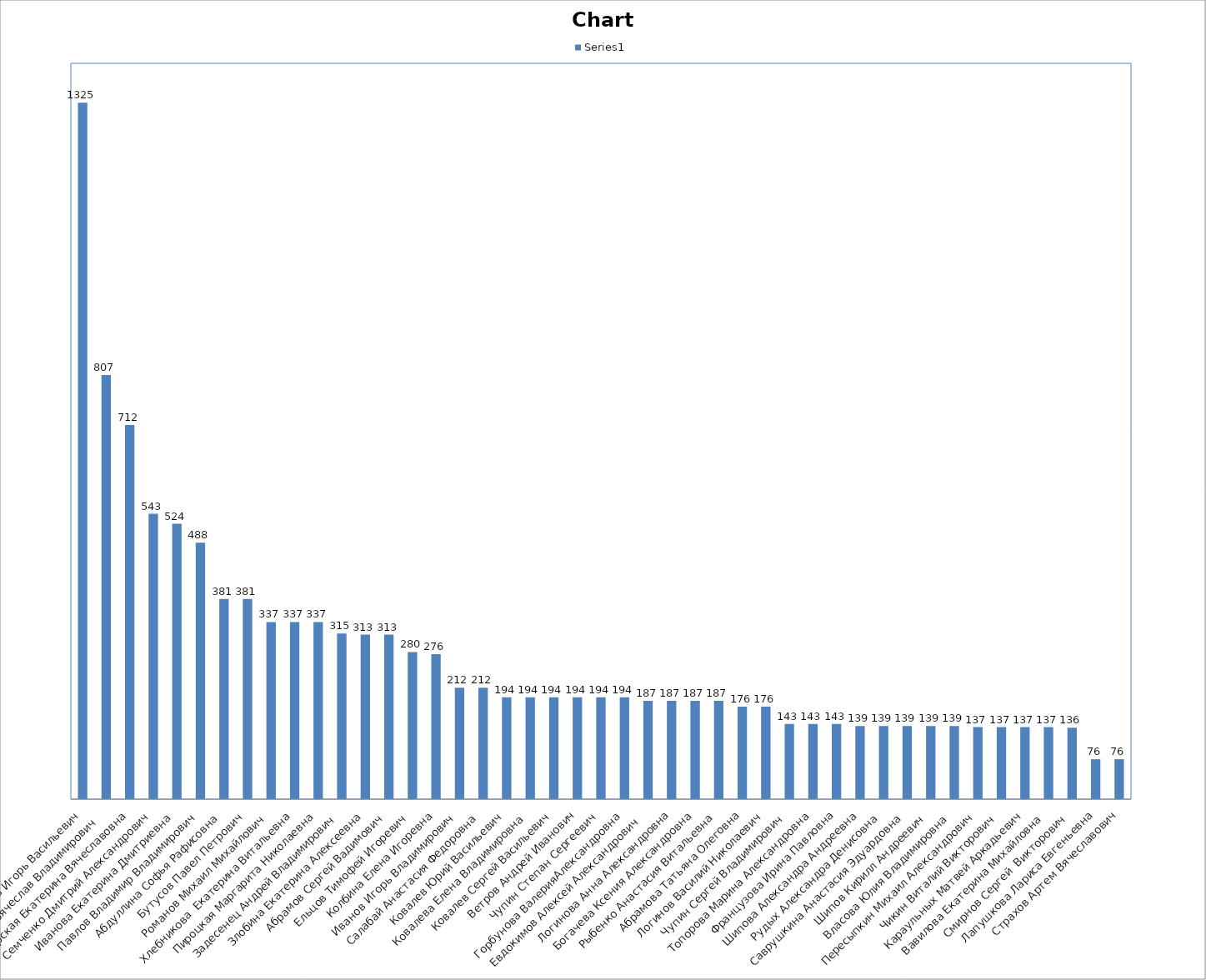
| Category | Series 0 |
|---|---|
| Макаров Игорь Васильевич | 1325 |
| Татарский Вячеслав Владимирович  | 807 |
| Татарская Екатерина Вячеславовна | 712 |
| Семченко Дмитрий Александрович | 543 |
| Иванова Екатерина Дмитриевна  | 524 |
| Павлов Владимир Владимирович | 488 |
| Абдуллина Софья Рафисовна | 381 |
| Бутусов Павел Петрович | 381 |
| Романов Михаил Михайлович | 337 |
| Хлебникова  Екатерина Витальевна | 337 |
| Пироцкая Маргарита Николаевна | 337 |
| Задесенец Андрей Владимирович | 315 |
| Злобина Екатерина Алексеевна | 313 |
| Абрамов Сергей Вадимович | 313 |
| Ельцов Тимофей Игоревич | 280 |
| Колбина Елена Игоревна | 276 |
| Иванов Игорь Владимирович | 212 |
| Салабай Анастасия Федоровна | 212 |
| Ковалев Юрий Васильевич | 194 |
| Ковалева Елена Владимировна | 194 |
| Ковалев Сергей Васильевич | 194 |
| Ветров Андрей Иванович | 194 |
| Чупин Степан Сергеевич | 194 |
| Горбунова ВалерияАлександровна | 194 |
| Евдокимов Алексей Александрович  | 187 |
| Логинова Анна Александровна | 187 |
| Богачева Ксения Александровна | 187 |
| Рыбенко Анастасия Витальевна | 187 |
| Абрамова Татьяна Олеговна | 176 |
| Логинов Василий Николаевич | 176 |
| Чупин Сергей Владимирович | 143 |
| Топорова Марина Александровна | 143 |
| Французова Ирина Павловна | 143 |
| Шипова Александра Андреевна | 139 |
| Рудых Александра Денисовна | 139 |
| Саврушкина Анастасия Эдуардовна | 139 |
| Шипов Кирилл Андреевич | 139 |
| Власова Юлия Владимировна  | 139 |
| Пересыпкин Михаил Александрович | 137 |
| Чикин Виталий Викторович | 137 |
| Караульных Матвей Аркадьевич | 137 |
| Вавилова Екатерина Михайловна | 137 |
| Смирнов Сергей  Викторович | 136 |
| Лапушкова Лариса Евгеньевна | 76 |
| Страхов Артем Вячеславович | 76 |